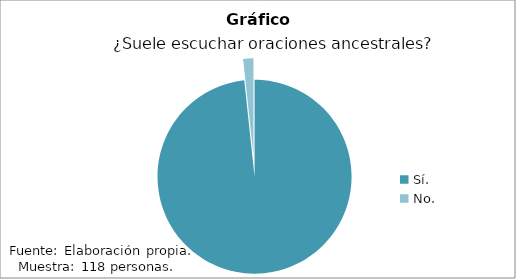
| Category | Series 0 |
|---|---|
| Sí. | 116 |
| No. | 2 |